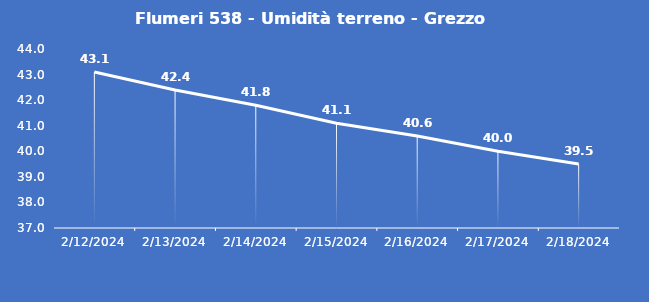
| Category | Flumeri 538 - Umidità terreno - Grezzo (%VWC) |
|---|---|
| 2/12/24 | 43.1 |
| 2/13/24 | 42.4 |
| 2/14/24 | 41.8 |
| 2/15/24 | 41.1 |
| 2/16/24 | 40.6 |
| 2/17/24 | 40 |
| 2/18/24 | 39.5 |